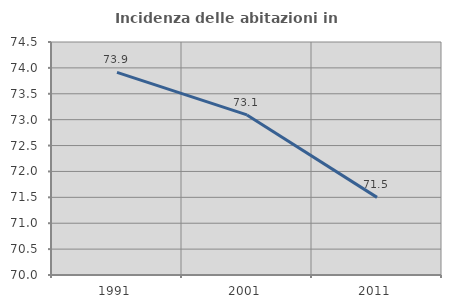
| Category | Incidenza delle abitazioni in proprietà  |
|---|---|
| 1991.0 | 73.913 |
| 2001.0 | 73.091 |
| 2011.0 | 71.499 |